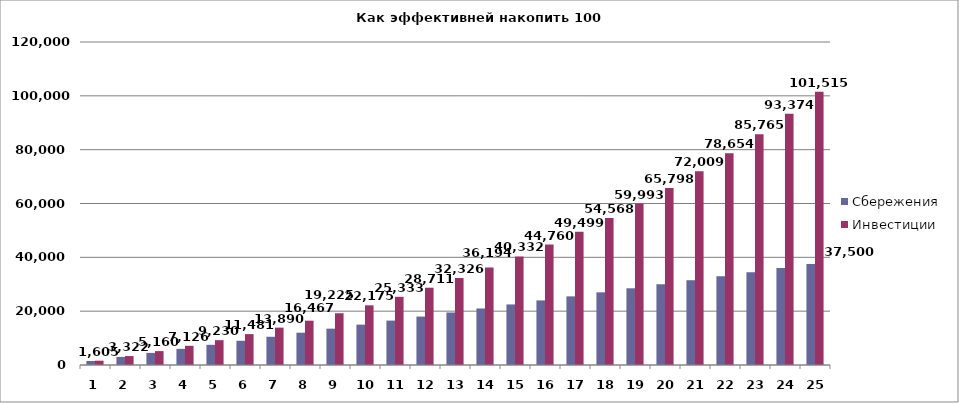
| Category | Сбережения | Инвестиции |
|---|---|---|
| 0 | 1500 | 1605 |
| 1 | 3000 | 3322.35 |
| 2 | 4500 | 5159.915 |
| 3 | 6000 | 7126.109 |
| 4 | 7500 | 9229.936 |
| 5 | 9000 | 11481.032 |
| 6 | 10500 | 13889.704 |
| 7 | 12000 | 16466.983 |
| 8 | 13500 | 19224.672 |
| 9 | 15000 | 22175.399 |
| 10 | 16500 | 25332.677 |
| 11 | 18000 | 28710.964 |
| 12 | 19500 | 32325.732 |
| 13 | 21000 | 36193.533 |
| 14 | 22500 | 40332.08 |
| 15 | 24000 | 44760.326 |
| 16 | 25500 | 49498.549 |
| 17 | 27000 | 54568.447 |
| 18 | 28500 | 59993.238 |
| 19 | 30000 | 65797.765 |
| 20 | 31500 | 72008.609 |
| 21 | 33000 | 78654.211 |
| 22 | 34500 | 85765.006 |
| 23 | 36000 | 93373.557 |
| 24 | 37500 | 101514.706 |